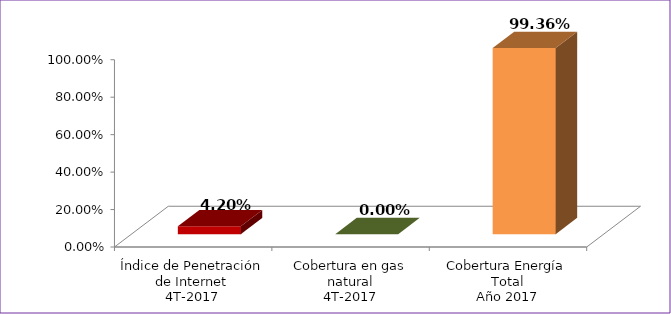
| Category | Series 0 |
|---|---|
| Índice de Penetración de Internet
4T-2017 | 0.042 |
| Cobertura en gas natural
4T-2017 | 0 |
| Cobertura Energía Total
Año 2017 | 0.994 |